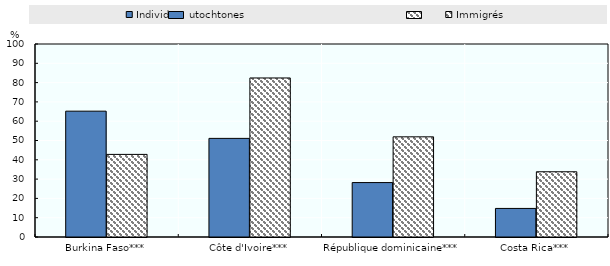
| Category | Individus autochtones | Immigrés |
|---|---|---|
| Burkina Faso*** | 65.2 | 42.8 |
| Côte d'Ivoire*** | 51.1 | 82.4 |
| République dominicaine*** | 28.2 | 51.9 |
| Costa Rica*** | 14.8 | 33.8 |